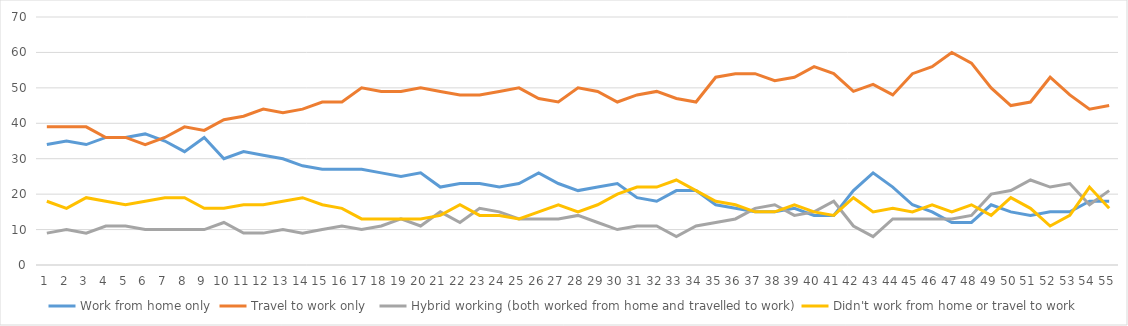
| Category | Work from home only | Travel to work only  | Hybrid working (both worked from home and travelled to work) | Didn't work from home or travel to work |
|---|---|---|---|---|
| 0 | 34 | 39 | 9 | 18 |
| 1 | 35 | 39 | 10 | 16 |
| 2 | 34 | 39 | 9 | 19 |
| 3 | 36 | 36 | 11 | 18 |
| 4 | 36 | 36 | 11 | 17 |
| 5 | 37 | 34 | 10 | 18 |
| 6 | 35 | 36 | 10 | 19 |
| 7 | 32 | 39 | 10 | 19 |
| 8 | 36 | 38 | 10 | 16 |
| 9 | 30 | 41 | 12 | 16 |
| 10 | 32 | 42 | 9 | 17 |
| 11 | 31 | 44 | 9 | 17 |
| 12 | 30 | 43 | 10 | 18 |
| 13 | 28 | 44 | 9 | 19 |
| 14 | 27 | 46 | 10 | 17 |
| 15 | 27 | 46 | 11 | 16 |
| 16 | 27 | 50 | 10 | 13 |
| 17 | 26 | 49 | 11 | 13 |
| 18 | 25 | 49 | 13 | 13 |
| 19 | 26 | 50 | 11 | 13 |
| 20 | 22 | 49 | 15 | 14 |
| 21 | 23 | 48 | 12 | 17 |
| 22 | 23 | 48 | 16 | 14 |
| 23 | 22 | 49 | 15 | 14 |
| 24 | 23 | 50 | 13 | 13 |
| 25 | 26 | 47 | 13 | 15 |
| 26 | 23 | 46 | 13 | 17 |
| 27 | 21 | 50 | 14 | 15 |
| 28 | 22 | 49 | 12 | 17 |
| 29 | 23 | 46 | 10 | 20 |
| 30 | 19 | 48 | 11 | 22 |
| 31 | 18 | 49 | 11 | 22 |
| 32 | 21 | 47 | 8 | 24 |
| 33 | 21 | 46 | 11 | 21 |
| 34 | 17 | 53 | 12 | 18 |
| 35 | 16 | 54 | 13 | 17 |
| 36 | 15 | 54 | 16 | 15 |
| 37 | 15 | 52 | 17 | 15 |
| 38 | 16 | 53 | 14 | 17 |
| 39 | 14 | 56 | 15 | 15 |
| 40 | 14 | 54 | 18 | 14 |
| 41 | 21 | 49 | 11 | 19 |
| 42 | 26 | 51 | 8 | 15 |
| 43 | 22 | 48 | 13 | 16 |
| 44 | 17 | 54 | 13 | 15 |
| 45 | 15 | 56 | 13 | 17 |
| 46 | 12 | 60 | 13 | 15 |
| 47 | 12 | 57 | 14 | 17 |
| 48 | 17 | 50 | 20 | 14 |
| 49 | 15 | 45 | 21 | 19 |
| 50 | 14 | 46 | 24 | 16 |
| 51 | 15 | 53 | 22 | 11 |
| 52 | 15 | 48 | 23 | 14 |
| 53 | 18 | 44 | 17 | 22 |
| 54 | 18 | 45 | 21 | 16 |